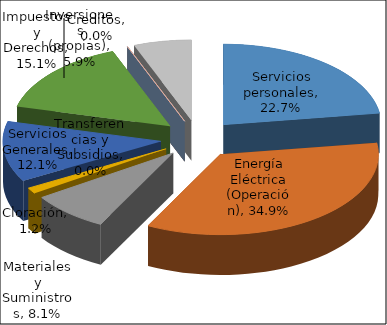
| Category | Series 1 |
|---|---|
| Servicios personales | 0.227 |
| Energía Eléctrica (Operación) | 0.349 |
| Materiales y Suministros | 0.081 |
| Cloración | 0.012 |
| Servicios Generales | 0.121 |
| Impuestos y Derechos | 0.151 |
| Transferencias y Subsidios | 0 |
| Creditos | 0 |
| Inversiones (propias) | 0.059 |